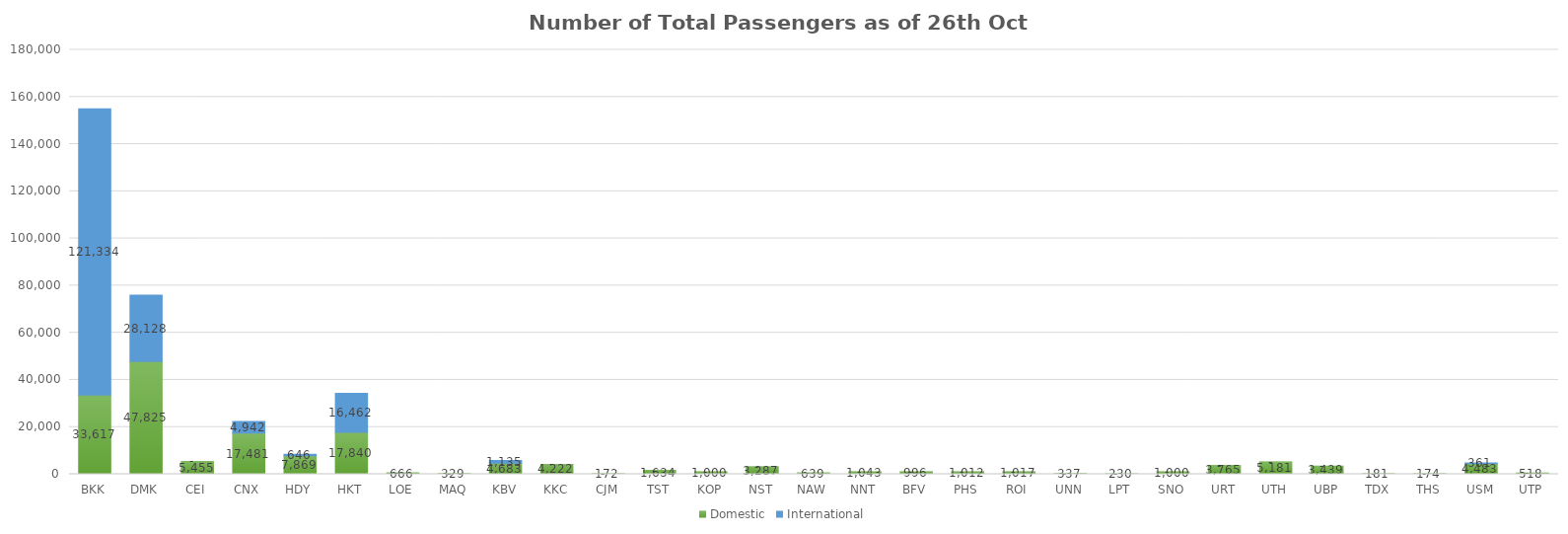
| Category | Domestic | International |
|---|---|---|
| BKK | 33617 | 121334 |
| DMK | 47825 | 28128 |
| CEI | 5455 | 0 |
| CNX | 17481 | 4942 |
| HDY | 7869 | 646 |
| HKT | 17840 | 16462 |
| LOE | 666 | 0 |
| MAQ | 329 | 0 |
| KBV | 4683 | 1135 |
| KKC | 4222 | 0 |
| CJM | 172 | 0 |
| TST | 1634 | 0 |
| KOP | 1000 | 0 |
| NST | 3287 | 0 |
| NAW | 639 | 0 |
| NNT | 1043 | 0 |
| BFV | 996 | 0 |
| PHS | 1012 | 0 |
| ROI | 1017 | 0 |
| UNN | 337 | 0 |
| LPT | 230 | 0 |
| SNO | 1000 | 0 |
| URT | 3765 | 0 |
| UTH | 5181 | 0 |
| UBP | 3439 | 0 |
| TDX | 181 | 0 |
| THS | 174 | 0 |
| USM | 4483 | 361 |
| UTP | 518 | 0 |